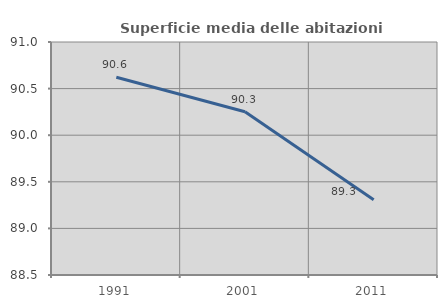
| Category | Superficie media delle abitazioni occupate |
|---|---|
| 1991.0 | 90.622 |
| 2001.0 | 90.251 |
| 2011.0 | 89.308 |